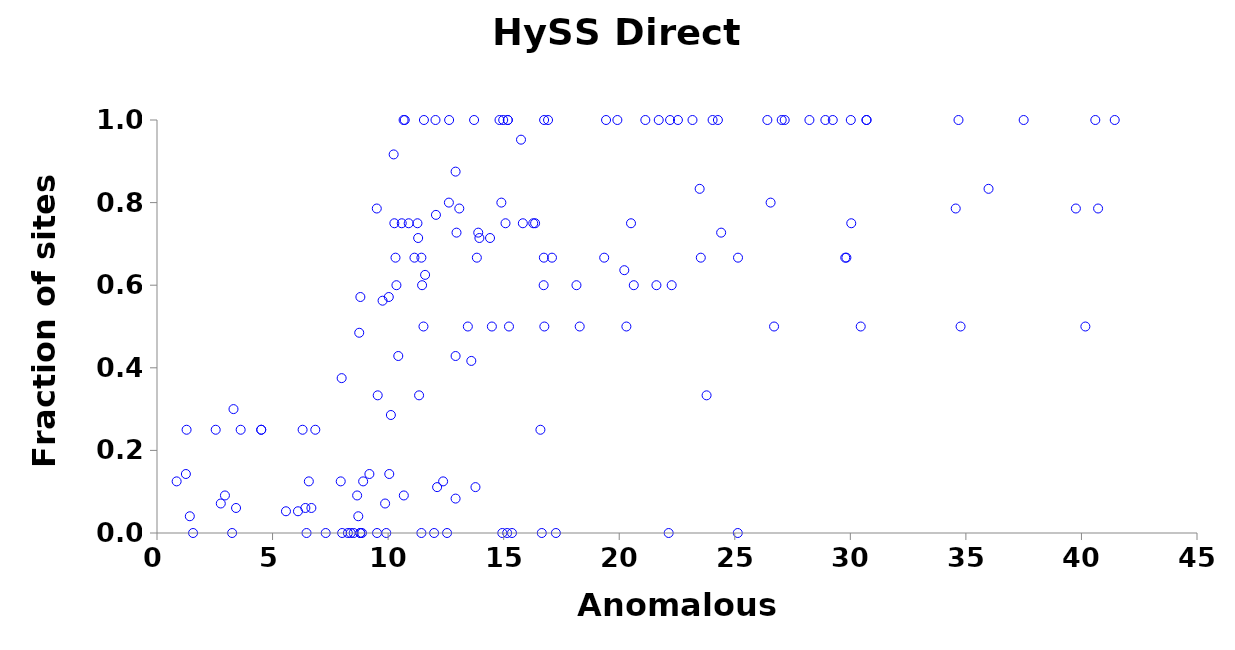
| Category | Direct Methods |
|---|---|
| 14.94 | 0 |
| 15.18 | 1 |
| 22.14 | 0 |
| 25.13 | 0 |
| 12.05 | 1 |
| 12.64 | 1 |
| 41.44 | 1 |
| 7.3 | 0 |
| 19.35 | 0.667 |
| 23.78 | 0.333 |
| 29.78 | 0.667 |
| 8.8 | 0 |
| 9.55 | 0.333 |
| 9.92 | 0 |
| 10.67 | 1 |
| 11.44 | 0.667 |
| 13.84 | 0.667 |
| 15.18 | 1 |
| 16.74 | 0.667 |
| 19.43 | 1 |
| 23.53 | 0.667 |
| 25.14 | 0.667 |
| 29.83 | 0.667 |
| 1.28 | 0.25 |
| 1.56 | 0 |
| 2.54 | 0.25 |
| 3.62 | 0.25 |
| 6.47 | 0 |
| 30.45 | 0.5 |
| 34.77 | 0.5 |
| 40.17 | 0.5 |
| 20.31 | 0.5 |
| 26.7 | 0.5 |
| 8.51 | 0 |
| 11.27 | 0.75 |
| 11.55 | 1 |
| 14.98 | 1 |
| 15.08 | 0.75 |
| 16.59 | 0.25 |
| 16.92 | 1 |
| 18.29 | 0.5 |
| 19.92 | 1 |
| 20.51 | 0.75 |
| 21.13 | 1 |
| 22.2 | 1 |
| 22.54 | 1 |
| 27.16 | 1 |
| 28.23 | 1 |
| 30.04 | 0.75 |
| 8.26 | 0 |
| 16.73 | 0.6 |
| 20.63 | 0.6 |
| 8.38 | 0 |
| 10.36 | 0.6 |
| 11.47 | 0.6 |
| 12.63 | 0.8 |
| 14.82 | 1 |
| 14.9 | 0.8 |
| 15.36 | 0 |
| 17.26 | 0 |
| 21.61 | 0.6 |
| 21.71 | 1 |
| 28.92 | 1 |
| 29.24 | 1 |
| 16.75 | 1 |
| 23.17 | 1 |
| 24.04 | 1 |
| 24.27 | 1 |
| 26.41 | 1 |
| 27.03 | 1 |
| 30.02 | 1 |
| 30.7 | 1 |
| 30.7 | 1 |
| 34.68 | 1 |
| 37.5 | 1 |
| 10.05 | 0.143 |
| 8.8 | 0.571 |
| 9.19 | 0.143 |
| 10.03 | 0.571 |
| 10.12 | 0.286 |
| 12.92 | 0.429 |
| 0.85 | 0.125 |
| 6.57 | 0.125 |
| 4.51 | 0.25 |
| 6.3 | 0.25 |
| 4.51 | 0.25 |
| 6.85 | 0.25 |
| 40.6 | 1 |
| 3.25 | 0 |
| 8.87 | 0 |
| 14.49 | 0.5 |
| 7.95 | 0.125 |
| 7.99 | 0.375 |
| 8.01 | 0 |
| 9.52 | 0 |
| 10.72 | 1 |
| 11.44 | 0 |
| 11.53 | 0.5 |
| 11.99 | 0 |
| 12.38 | 0.125 |
| 12.55 | 0 |
| 12.92 | 0.875 |
| 13.72 | 1 |
| 15.15 | 0 |
| 16.28 | 0.75 |
| 16.65 | 0 |
| 10.32 | 0.667 |
| 11.14 | 0.667 |
| 17.09 | 0.667 |
| 3.31 | 0.3 |
| 8.79 | 0 |
| 16.76 | 0.5 |
| 18.15 | 0.6 |
| 13.45 | 0.5 |
| 22.27 | 0.6 |
| 26.55 | 0.8 |
| 15.23 | 0.5 |
| 10.68 | 0.091 |
| 2.94 | 0.091 |
| 13.9 | 0.727 |
| 20.22 | 0.636 |
| 24.41 | 0.727 |
| 10.24 | 0.917 |
| 10.27 | 0.75 |
| 10.89 | 0.75 |
| 12.92 | 0.083 |
| 13.6 | 0.417 |
| 15.83 | 0.75 |
| 16.36 | 0.75 |
| 1.25 | 0.143 |
| 2.76 | 0.071 |
| 9.87 | 0.071 |
| 10.44 | 0.429 |
| 9.51 | 0.786 |
| 11.3 | 0.714 |
| 13.08 | 0.786 |
| 13.95 | 0.714 |
| 34.56 | 0.786 |
| 39.76 | 0.786 |
| 40.72 | 0.786 |
| 11.6 | 0.625 |
| 8.92 | 0.125 |
| 9.76 | 0.562 |
| 10.59 | 0.75 |
| 23.48 | 0.833 |
| 35.98 | 0.833 |
| 14.41 | 0.714 |
| 15.75 | 0.952 |
| 8.66 | 0.091 |
| 12.96 | 0.727 |
| 13.78 | 0.111 |
| 11.34 | 0.333 |
| 12.12 | 0.111 |
| 6.42 | 0.061 |
| 6.68 | 0.061 |
| 8.75 | 0.485 |
| 6.1 | 0.053 |
| 5.58 | 0.053 |
| 3.42 | 0.061 |
| 8.71 | 0.041 |
| 1.42 | 0.041 |
| 12.07 | 0.77 |